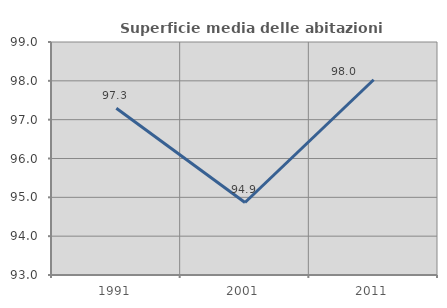
| Category | Superficie media delle abitazioni occupate |
|---|---|
| 1991.0 | 97.294 |
| 2001.0 | 94.867 |
| 2011.0 | 98.029 |